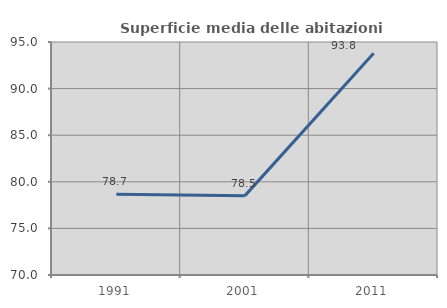
| Category | Superficie media delle abitazioni occupate |
|---|---|
| 1991.0 | 78.653 |
| 2001.0 | 78.516 |
| 2011.0 | 93.789 |